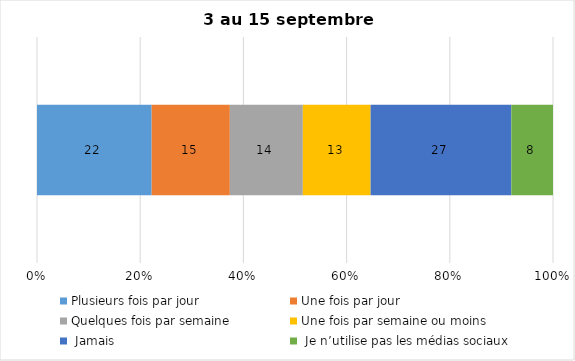
| Category | Plusieurs fois par jour | Une fois par jour | Quelques fois par semaine   | Une fois par semaine ou moins   |  Jamais   |  Je n’utilise pas les médias sociaux |
|---|---|---|---|---|---|---|
| 0 | 22 | 15 | 14 | 13 | 27 | 8 |